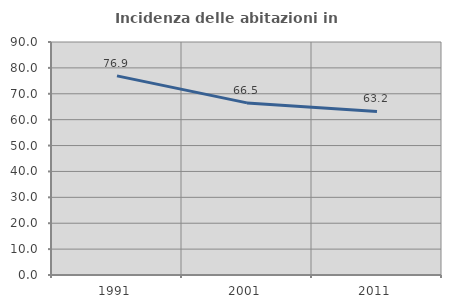
| Category | Incidenza delle abitazioni in proprietà  |
|---|---|
| 1991.0 | 76.923 |
| 2001.0 | 66.481 |
| 2011.0 | 63.196 |